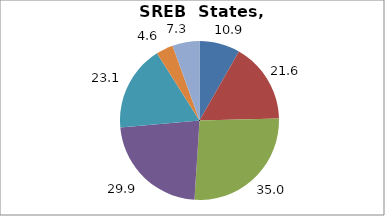
| Category | Series 0 |
|---|---|
| Higher Education | 10.949 |
| Elementary and Secondary Education | 21.649 |
| Total Education1 | 35.045 |
| Social Welfare2 | 29.912 |
| Transportation, Public Safety, Environment and Housing3 | 23.117 |
| Administration | 4.639 |
| Other4 | 7.287 |